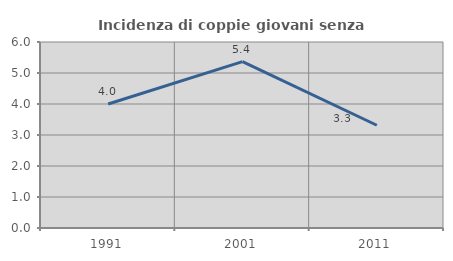
| Category | Incidenza di coppie giovani senza figli |
|---|---|
| 1991.0 | 4 |
| 2001.0 | 5.366 |
| 2011.0 | 3.315 |